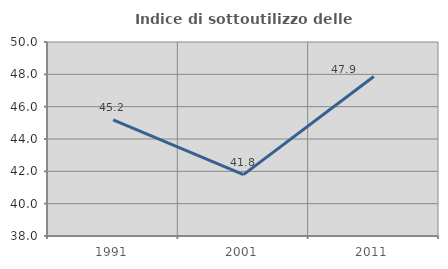
| Category | Indice di sottoutilizzo delle abitazioni  |
|---|---|
| 1991.0 | 45.179 |
| 2001.0 | 41.799 |
| 2011.0 | 47.87 |